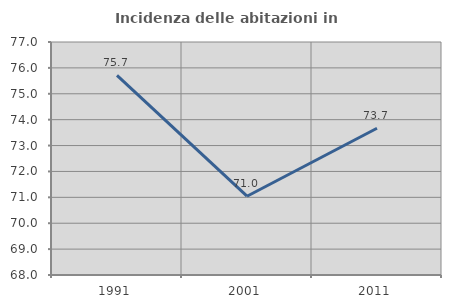
| Category | Incidenza delle abitazioni in proprietà  |
|---|---|
| 1991.0 | 75.711 |
| 2001.0 | 71.043 |
| 2011.0 | 73.669 |